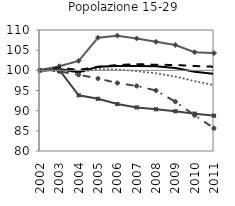
| Category | EU 25 | EU 15 | Germania | Spagna | Francia | Italia |
|---|---|---|---|---|---|---|
| 2002.0 | 100 | 100 | 100 | 100 | 100 | 100 |
| 2003.0 | 100.024 | 100.34 | 101.022 | 99.726 | 100.607 | 100.083 |
| 2004.0 | 99.5 | 99.542 | 102.353 | 98.908 | 100.108 | 93.815 |
| 2005.0 | 100.309 | 100.859 | 108.089 | 97.968 | 100.847 | 92.945 |
| 2006.0 | 100.211 | 101.069 | 108.601 | 96.859 | 101.313 | 91.644 |
| 2007.0 | 99.803 | 101.091 | 107.908 | 96.125 | 101.528 | 90.802 |
| 2008.0 | 99.261 | 101.001 | 107.068 | 94.999 | 101.383 | 90.34 |
| 2009.0 | 98.463 | 100.551 | 106.284 | 92.225 | 101.328 | 89.844 |
| 2010.0 | 97.309 | 99.629 | 104.496 | 88.856 | 101.066 | 89.26 |
| 2011.0 | 96.341 | 99.127 | 104.285 | 85.641 | 100.893 | 88.75 |